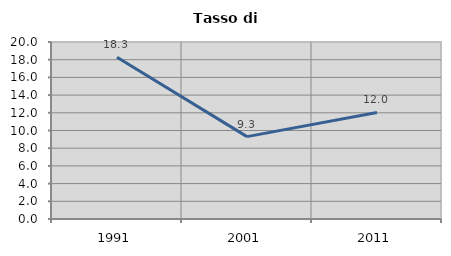
| Category | Tasso di disoccupazione   |
|---|---|
| 1991.0 | 18.272 |
| 2001.0 | 9.309 |
| 2011.0 | 12.043 |